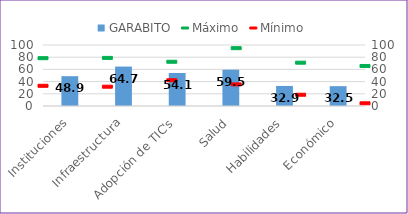
| Category | GARABITO |
|---|---|
| Instituciones | 48.89 |
| Infraestructura | 64.665 |
| Adopción de TIC's | 54.08 |
| Salud | 59.498 |
| Habilidades | 32.875 |
| Económico | 32.518 |